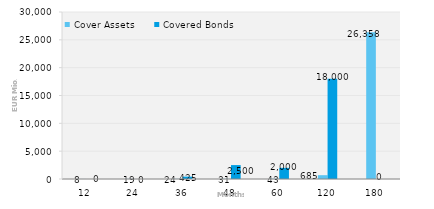
| Category | Cover Assets | Covered Bonds |
|---|---|---|
| 12.0 | 7.927 | 0 |
| 24.0 | 18.688 | 0 |
| 36.0 | 24.288 | 425 |
| 48.0 | 30.91 | 2500 |
| 60.0 | 42.929 | 2000 |
| 120.0 | 685.213 | 18000 |
| 180.0 | 26358.02 | 0 |